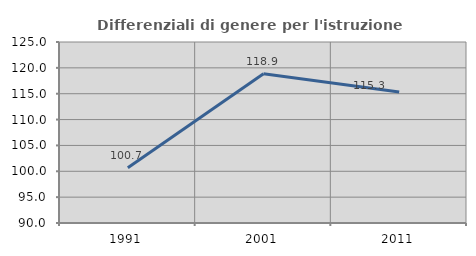
| Category | Differenziali di genere per l'istruzione superiore |
|---|---|
| 1991.0 | 100.69 |
| 2001.0 | 118.852 |
| 2011.0 | 115.314 |